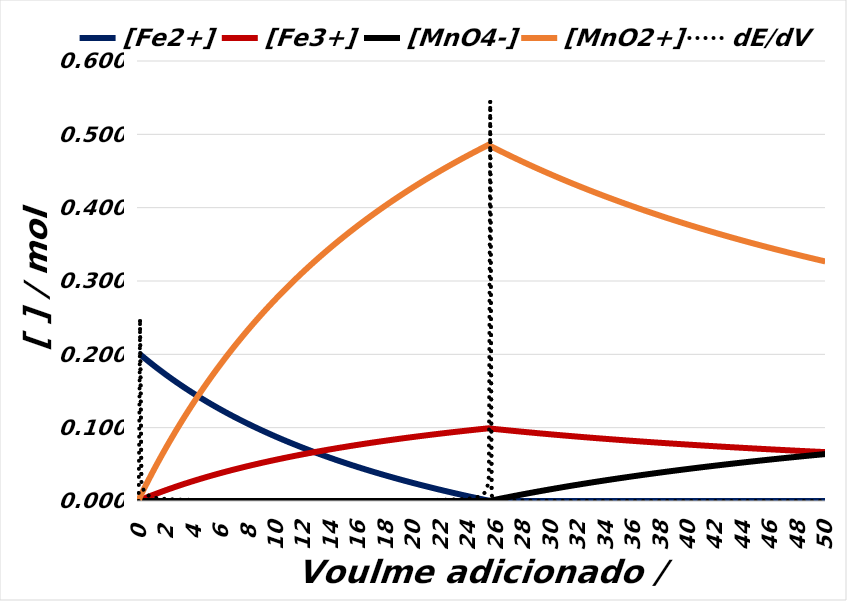
| Category | [Fe2+] | [Fe3+] | [MnO4-] | [MnO2+] |
|---|---|---|---|---|
| 0.0 | 0.2 | 0 | 0 | 0 |
| 0.1 | 0.2 | 0.001 | 0 | 0.006 |
| 0.2 | 0.198 | 0.002 | 0 | 0.01 |
| 0.3 | 0.197 | 0.003 | 0 | 0.013 |
| 0.4 | 0.195 | 0.003 | 0 | 0.017 |
| 0.5 | 0.194 | 0.004 | 0 | 0.021 |
| 0.6 | 0.192 | 0.005 | 0 | 0.024 |
| 0.7 | 0.191 | 0.006 | 0 | 0.028 |
| 0.8 | 0.189 | 0.006 | 0 | 0.032 |
| 0.9 | 0.188 | 0.007 | 0 | 0.035 |
| 1.0 | 0.186 | 0.008 | 0 | 0.039 |
| 1.1 | 0.185 | 0.009 | 0 | 0.042 |
| 1.2 | 0.183 | 0.009 | 0 | 0.046 |
| 1.3 | 0.182 | 0.01 | 0 | 0.049 |
| 1.4 | 0.18 | 0.011 | 0 | 0.053 |
| 1.5 | 0.179 | 0.011 | 0 | 0.056 |
| 1.6 | 0.178 | 0.012 | 0 | 0.06 |
| 1.7 | 0.176 | 0.013 | 0 | 0.063 |
| 1.8 | 0.175 | 0.014 | 0 | 0.066 |
| 1.9 | 0.173 | 0.014 | 0 | 0.07 |
| 2.0 | 0.172 | 0.015 | 0 | 0.073 |
| 2.1 | 0.171 | 0.016 | 0 | 0.076 |
| 2.2 | 0.169 | 0.016 | 0 | 0.079 |
| 2.3 | 0.168 | 0.017 | 0 | 0.083 |
| 2.4 | 0.167 | 0.018 | 0 | 0.086 |
| 2.5 | 0.165 | 0.018 | 0 | 0.089 |
| 2.6 | 0.164 | 0.019 | 0 | 0.092 |
| 2.7 | 0.163 | 0.019 | 0 | 0.095 |
| 2.8 | 0.161 | 0.02 | 0 | 0.098 |
| 2.9 | 0.16 | 0.021 | 0 | 0.102 |
| 3.0 | 0.159 | 0.021 | 0 | 0.105 |
| 3.1 | 0.158 | 0.022 | 0 | 0.108 |
| 3.2 | 0.156 | 0.023 | 0 | 0.111 |
| 3.3 | 0.155 | 0.023 | 0 | 0.114 |
| 3.4 | 0.154 | 0.024 | 0 | 0.117 |
| 3.5 | 0.153 | 0.024 | 0 | 0.12 |
| 3.6 | 0.151 | 0.025 | 0 | 0.123 |
| 3.7 | 0.15 | 0.026 | 0 | 0.126 |
| 3.8 | 0.149 | 0.026 | 0 | 0.128 |
| 3.9 | 0.148 | 0.027 | 0 | 0.131 |
| 4.0 | 0.147 | 0.027 | 0 | 0.134 |
| 4.1 | 0.145 | 0.028 | 0 | 0.137 |
| 4.2 | 0.144 | 0.029 | 0 | 0.14 |
| 4.3 | 0.143 | 0.029 | 0 | 0.143 |
| 4.4 | 0.142 | 0.03 | 0 | 0.145 |
| 4.5 | 0.141 | 0.03 | 0 | 0.148 |
| 4.6 | 0.14 | 0.031 | 0 | 0.151 |
| 4.7 | 0.138 | 0.031 | 0 | 0.154 |
| 4.8 | 0.137 | 0.032 | 0 | 0.156 |
| 4.9 | 0.136 | 0.032 | 0 | 0.159 |
| 5.0 | 0.135 | 0.033 | 0 | 0.162 |
| 5.1 | 0.134 | 0.034 | 0 | 0.164 |
| 5.2 | 0.133 | 0.034 | 0 | 0.167 |
| 5.3 | 0.132 | 0.035 | 0 | 0.17 |
| 5.4 | 0.131 | 0.035 | 0 | 0.172 |
| 5.5 | 0.13 | 0.036 | 0 | 0.175 |
| 5.6 | 0.129 | 0.036 | 0 | 0.177 |
| 5.7 | 0.128 | 0.037 | 0 | 0.18 |
| 5.8 | 0.126 | 0.037 | 0 | 0.182 |
| 5.9 | 0.125 | 0.038 | 0 | 0.185 |
| 6.0 | 0.124 | 0.038 | 0 | 0.187 |
| 6.1 | 0.123 | 0.039 | 0 | 0.19 |
| 6.2 | 0.122 | 0.039 | 0 | 0.192 |
| 6.3 | 0.121 | 0.04 | 0 | 0.195 |
| 6.4 | 0.12 | 0.04 | 0 | 0.197 |
| 6.5 | 0.119 | 0.041 | 0 | 0.2 |
| 6.6 | 0.118 | 0.041 | 0 | 0.202 |
| 6.7 | 0.117 | 0.042 | 0 | 0.205 |
| 6.8 | 0.116 | 0.042 | 0 | 0.207 |
| 6.9 | 0.115 | 0.043 | 0 | 0.209 |
| 7.0 | 0.114 | 0.043 | 0 | 0.212 |
| 7.1 | 0.113 | 0.044 | 0 | 0.214 |
| 7.2 | 0.112 | 0.044 | 0 | 0.216 |
| 7.3 | 0.111 | 0.045 | 0 | 0.219 |
| 7.4 | 0.111 | 0.045 | 0 | 0.221 |
| 7.5 | 0.11 | 0.046 | 0 | 0.223 |
| 7.6 | 0.109 | 0.046 | 0 | 0.225 |
| 7.7 | 0.108 | 0.046 | 0 | 0.228 |
| 7.8 | 0.107 | 0.047 | 0 | 0.23 |
| 7.9 | 0.106 | 0.047 | 0 | 0.232 |
| 8.0 | 0.105 | 0.048 | 0 | 0.234 |
| 8.1 | 0.104 | 0.048 | 0 | 0.237 |
| 8.2 | 0.103 | 0.049 | 0 | 0.239 |
| 8.3 | 0.102 | 0.049 | 0 | 0.241 |
| 8.4 | 0.101 | 0.05 | 0 | 0.243 |
| 8.5 | 0.1 | 0.05 | 0 | 0.245 |
| 8.6 | 0.1 | 0.05 | 0 | 0.247 |
| 8.7 | 0.099 | 0.051 | 0 | 0.249 |
| 8.8 | 0.098 | 0.051 | 0 | 0.251 |
| 8.9 | 0.097 | 0.052 | 0 | 0.254 |
| 9.0 | 0.096 | 0.052 | 0 | 0.256 |
| 9.1 | 0.095 | 0.053 | 0 | 0.258 |
| 9.2 | 0.094 | 0.053 | 0 | 0.26 |
| 9.3 | 0.093 | 0.053 | 0 | 0.262 |
| 9.4 | 0.093 | 0.054 | 0 | 0.264 |
| 9.5 | 0.092 | 0.054 | 0 | 0.266 |
| 9.6 | 0.091 | 0.055 | 0 | 0.268 |
| 9.7 | 0.09 | 0.055 | 0 | 0.27 |
| 9.8 | 0.089 | 0.055 | 0 | 0.272 |
| 9.9 | 0.088 | 0.056 | 0 | 0.274 |
| 10.0 | 0.088 | 0.056 | 0 | 0.276 |
| 10.1 | 0.087 | 0.057 | 0 | 0.278 |
| 10.2 | 0.086 | 0.057 | 0 | 0.28 |
| 10.3 | 0.085 | 0.057 | 0 | 0.282 |
| 10.4 | 0.084 | 0.058 | 0 | 0.284 |
| 10.5 | 0.084 | 0.058 | 0 | 0.285 |
| 10.6 | 0.083 | 0.059 | 0 | 0.287 |
| 10.7 | 0.082 | 0.059 | 0 | 0.289 |
| 10.8 | 0.081 | 0.059 | 0 | 0.291 |
| 10.9 | 0.081 | 0.06 | 0 | 0.293 |
| 11.0 | 0.08 | 0.06 | 0 | 0.295 |
| 11.1 | 0.079 | 0.061 | 0 | 0.297 |
| 11.2 | 0.078 | 0.061 | 0 | 0.298 |
| 11.3 | 0.077 | 0.061 | 0 | 0.3 |
| 11.4 | 0.077 | 0.062 | 0 | 0.302 |
| 11.5 | 0.076 | 0.062 | 0 | 0.304 |
| 11.6 | 0.075 | 0.062 | 0 | 0.306 |
| 11.7 | 0.074 | 0.063 | 0 | 0.308 |
| 11.8 | 0.074 | 0.063 | 0 | 0.309 |
| 11.9 | 0.073 | 0.063 | 0 | 0.311 |
| 12.0 | 0.072 | 0.064 | 0 | 0.313 |
| 12.1 | 0.072 | 0.064 | 0 | 0.315 |
| 12.2 | 0.071 | 0.065 | 0 | 0.316 |
| 12.3 | 0.07 | 0.065 | 0 | 0.318 |
| 12.4 | 0.069 | 0.065 | 0 | 0.32 |
| 12.5 | 0.069 | 0.066 | 0 | 0.321 |
| 12.6 | 0.068 | 0.066 | 0 | 0.323 |
| 12.7 | 0.067 | 0.066 | 0 | 0.325 |
| 12.8 | 0.067 | 0.067 | 0 | 0.327 |
| 12.9 | 0.066 | 0.067 | 0 | 0.328 |
| 13.0 | 0.065 | 0.067 | 0 | 0.33 |
| 13.1 | 0.065 | 0.068 | 0 | 0.332 |
| 13.2 | 0.064 | 0.068 | 0 | 0.333 |
| 13.3 | 0.063 | 0.068 | 0 | 0.335 |
| 13.4 | 0.062 | 0.069 | 0 | 0.336 |
| 13.5 | 0.062 | 0.069 | 0 | 0.338 |
| 13.6 | 0.061 | 0.069 | 0 | 0.34 |
| 13.7 | 0.06 | 0.07 | 0 | 0.341 |
| 13.8 | 0.06 | 0.07 | 0 | 0.343 |
| 13.9 | 0.059 | 0.07 | 0 | 0.344 |
| 14.0 | 0.058 | 0.071 | 0 | 0.346 |
| 14.1 | 0.058 | 0.071 | 0 | 0.348 |
| 14.2 | 0.057 | 0.071 | 0 | 0.349 |
| 14.3 | 0.057 | 0.072 | 0 | 0.351 |
| 14.4 | 0.056 | 0.072 | 0 | 0.352 |
| 14.5 | 0.055 | 0.072 | 0 | 0.354 |
| 14.6 | 0.055 | 0.073 | 0 | 0.355 |
| 14.7 | 0.054 | 0.073 | 0 | 0.357 |
| 14.8 | 0.053 | 0.073 | 0 | 0.358 |
| 14.9 | 0.053 | 0.073 | 0 | 0.36 |
| 15.0 | 0.052 | 0.074 | 0 | 0.361 |
| 15.1 | 0.052 | 0.074 | 0 | 0.363 |
| 15.2 | 0.051 | 0.074 | 0 | 0.364 |
| 15.3 | 0.05 | 0.075 | 0 | 0.366 |
| 15.4 | 0.05 | 0.075 | 0 | 0.367 |
| 15.5 | 0.049 | 0.075 | 0 | 0.369 |
| 15.6 | 0.048 | 0.076 | 0 | 0.37 |
| 15.7 | 0.048 | 0.076 | 0 | 0.372 |
| 15.8 | 0.047 | 0.076 | 0 | 0.373 |
| 15.9 | 0.047 | 0.076 | 0 | 0.375 |
| 16.0 | 0.046 | 0.077 | 0 | 0.376 |
| 16.1 | 0.045 | 0.077 | 0 | 0.377 |
| 16.2 | 0.045 | 0.077 | 0 | 0.379 |
| 16.3 | 0.044 | 0.078 | 0 | 0.38 |
| 16.4 | 0.044 | 0.078 | 0 | 0.382 |
| 16.5 | 0.043 | 0.078 | 0 | 0.383 |
| 16.6 | 0.043 | 0.078 | 0 | 0.384 |
| 16.7 | 0.042 | 0.079 | 0 | 0.386 |
| 16.8 | 0.041 | 0.079 | 0 | 0.387 |
| 16.9 | 0.041 | 0.079 | 0 | 0.389 |
| 17.0 | 0.04 | 0.08 | 0 | 0.39 |
| 17.1 | 0.04 | 0.08 | 0 | 0.391 |
| 17.2 | 0.039 | 0.08 | 0 | 0.393 |
| 17.3 | 0.039 | 0.08 | 0 | 0.394 |
| 17.4 | 0.038 | 0.081 | 0 | 0.395 |
| 17.5 | 0.037 | 0.081 | 0 | 0.397 |
| 17.6 | 0.037 | 0.081 | 0 | 0.398 |
| 17.7 | 0.036 | 0.081 | 0 | 0.399 |
| 17.8 | 0.036 | 0.082 | 0 | 0.401 |
| 17.9 | 0.035 | 0.082 | 0 | 0.402 |
| 18.0 | 0.035 | 0.082 | 0 | 0.403 |
| 18.1 | 0.034 | 0.083 | 0 | 0.404 |
| 18.2 | 0.034 | 0.083 | 0 | 0.406 |
| 18.3 | 0.033 | 0.083 | 0 | 0.407 |
| 18.4 | 0.033 | 0.083 | 0 | 0.408 |
| 18.5 | 0.032 | 0.084 | 0 | 0.41 |
| 18.6 | 0.032 | 0.084 | 0 | 0.411 |
| 18.7 | 0.031 | 0.084 | 0 | 0.412 |
| 18.8 | 0.031 | 0.084 | 0 | 0.413 |
| 18.9 | 0.03 | 0.085 | 0 | 0.415 |
| 19.0 | 0.03 | 0.085 | 0 | 0.416 |
| 19.1 | 0.029 | 0.085 | 0 | 0.417 |
| 19.2 | 0.028 | 0.085 | 0 | 0.418 |
| 19.3 | 0.028 | 0.086 | 0 | 0.42 |
| 19.4 | 0.027 | 0.086 | 0 | 0.421 |
| 19.5 | 0.027 | 0.086 | 0 | 0.422 |
| 19.6 | 0.026 | 0.086 | 0 | 0.423 |
| 19.7 | 0.026 | 0.087 | 0 | 0.424 |
| 19.8 | 0.025 | 0.087 | 0 | 0.426 |
| 19.9 | 0.025 | 0.087 | 0 | 0.427 |
| 20.0 | 0.024 | 0.087 | 0 | 0.428 |
| 20.1 | 0.024 | 0.088 | 0 | 0.429 |
| 20.2 | 0.024 | 0.088 | 0 | 0.43 |
| 20.3 | 0.023 | 0.088 | 0 | 0.431 |
| 20.4 | 0.023 | 0.088 | 0 | 0.433 |
| 20.5 | 0.022 | 0.089 | 0 | 0.434 |
| 20.6 | 0.022 | 0.089 | 0 | 0.435 |
| 20.7 | 0.021 | 0.089 | 0 | 0.436 |
| 20.8 | 0.021 | 0.089 | 0 | 0.437 |
| 20.9 | 0.02 | 0.089 | 0 | 0.438 |
| 21.0 | 0.02 | 0.09 | 0 | 0.44 |
| 21.1 | 0.019 | 0.09 | 0 | 0.441 |
| 21.2 | 0.019 | 0.09 | 0 | 0.442 |
| 21.3 | 0.018 | 0.09 | 0 | 0.443 |
| 21.4 | 0.018 | 0.091 | 0 | 0.444 |
| 21.5 | 0.017 | 0.091 | 0 | 0.445 |
| 21.6 | 0.017 | 0.091 | 0 | 0.446 |
| 21.7 | 0.016 | 0.091 | 0 | 0.447 |
| 21.8 | 0.016 | 0.092 | 0 | 0.448 |
| 21.9 | 0.016 | 0.092 | 0 | 0.45 |
| 22.0 | 0.015 | 0.092 | 0 | 0.451 |
| 22.1 | 0.015 | 0.092 | 0 | 0.452 |
| 22.2 | 0.014 | 0.092 | 0 | 0.453 |
| 22.3 | 0.014 | 0.093 | 0 | 0.454 |
| 22.4 | 0.013 | 0.093 | 0 | 0.455 |
| 22.5 | 0.013 | 0.093 | 0 | 0.456 |
| 22.6 | 0.012 | 0.093 | 0 | 0.457 |
| 22.7 | 0.012 | 0.093 | 0 | 0.458 |
| 22.8 | 0.012 | 0.094 | 0 | 0.459 |
| 22.9 | 0.011 | 0.094 | 0 | 0.46 |
| 23.0 | 0.011 | 0.094 | 0 | 0.461 |
| 23.1 | 0.01 | 0.094 | 0 | 0.462 |
| 23.2 | 0.01 | 0.095 | 0 | 0.463 |
| 23.3 | 0.009 | 0.095 | 0 | 0.464 |
| 23.4 | 0.009 | 0.095 | 0 | 0.465 |
| 23.5 | 0.009 | 0.095 | 0 | 0.466 |
| 23.6 | 0.008 | 0.095 | 0 | 0.467 |
| 23.7 | 0.008 | 0.096 | 0 | 0.468 |
| 23.8 | 0.007 | 0.096 | 0 | 0.469 |
| 23.9 | 0.007 | 0.096 | 0 | 0.47 |
| 24.0 | 0.006 | 0.096 | 0 | 0.471 |
| 24.1 | 0.006 | 0.096 | 0 | 0.472 |
| 24.2 | 0.006 | 0.097 | 0 | 0.473 |
| 24.3 | 0.005 | 0.097 | 0 | 0.474 |
| 24.4 | 0.005 | 0.097 | 0 | 0.475 |
| 24.5 | 0.004 | 0.097 | 0 | 0.476 |
| 24.6 | 0.004 | 0.097 | 0 | 0.477 |
| 24.7 | 0.004 | 0.098 | 0 | 0.478 |
| 24.8 | 0.003 | 0.098 | 0 | 0.479 |
| 24.9 | 0.003 | 0.098 | 0 | 0.48 |
| 25.0 | 0.002 | 0.098 | 0 | 0.481 |
| 25.1 | 0.002 | 0.098 | 0 | 0.482 |
| 25.2 | 0.002 | 0.099 | 0 | 0.483 |
| 25.3 | 0.001 | 0.099 | 0 | 0.484 |
| 25.4 | 0.001 | 0.099 | 0 | 0.485 |
| 25.5 | 0 | 0.099 | 0 | 0.486 |
| 25.6 | 0 | 0.099 | 0 | 0.484 |
| 25.7 | 0 | 0.099 | 0.001 | 0.483 |
| 25.8 | 0 | 0.098 | 0.001 | 0.482 |
| 25.9 | 0 | 0.098 | 0.002 | 0.481 |
| 26.0 | 0 | 0.098 | 0.002 | 0.48 |
| 26.1 | 0 | 0.098 | 0.002 | 0.479 |
| 26.2 | 0 | 0.098 | 0.003 | 0.479 |
| 26.3 | 0 | 0.097 | 0.003 | 0.478 |
| 26.4 | 0 | 0.097 | 0.003 | 0.477 |
| 26.5 | 0 | 0.097 | 0.004 | 0.476 |
| 26.6 | 0 | 0.097 | 0.004 | 0.475 |
| 26.7 | 0 | 0.097 | 0.005 | 0.474 |
| 26.8 | 0 | 0.097 | 0.005 | 0.473 |
| 26.9 | 0 | 0.096 | 0.005 | 0.472 |
| 27.0 | 0 | 0.096 | 0.006 | 0.471 |
| 27.1 | 0 | 0.096 | 0.006 | 0.47 |
| 27.2 | 0 | 0.096 | 0.006 | 0.469 |
| 27.3 | 0 | 0.096 | 0.007 | 0.468 |
| 27.4 | 0 | 0.095 | 0.007 | 0.468 |
| 27.5 | 0 | 0.095 | 0.007 | 0.467 |
| 27.6 | 0 | 0.095 | 0.008 | 0.466 |
| 27.7 | 0 | 0.095 | 0.008 | 0.465 |
| 27.8 | 0 | 0.095 | 0.008 | 0.464 |
| 27.9 | 0 | 0.095 | 0.009 | 0.463 |
| 28.0 | 0 | 0.094 | 0.009 | 0.462 |
| 28.1 | 0 | 0.094 | 0.01 | 0.461 |
| 28.2 | 0 | 0.094 | 0.01 | 0.461 |
| 28.3 | 0 | 0.094 | 0.01 | 0.46 |
| 28.4 | 0 | 0.094 | 0.011 | 0.459 |
| 28.5 | 0 | 0.093 | 0.011 | 0.458 |
| 28.6 | 0 | 0.093 | 0.011 | 0.457 |
| 28.7 | 0 | 0.093 | 0.012 | 0.456 |
| 28.8 | 0 | 0.093 | 0.012 | 0.455 |
| 28.9 | 0 | 0.093 | 0.012 | 0.455 |
| 29.0 | 0 | 0.093 | 0.013 | 0.454 |
| 29.1 | 0 | 0.092 | 0.013 | 0.453 |
| 29.2 | 0 | 0.092 | 0.013 | 0.452 |
| 29.3 | 0 | 0.092 | 0.014 | 0.451 |
| 29.4 | 0 | 0.092 | 0.014 | 0.45 |
| 29.5 | 0 | 0.092 | 0.014 | 0.45 |
| 29.6 | 0 | 0.092 | 0.015 | 0.449 |
| 29.7 | 0 | 0.091 | 0.015 | 0.448 |
| 29.8 | 0 | 0.091 | 0.015 | 0.447 |
| 29.9 | 0 | 0.091 | 0.016 | 0.446 |
| 30.0 | 0 | 0.091 | 0.016 | 0.445 |
| 30.1 | 0 | 0.091 | 0.016 | 0.445 |
| 30.2 | 0 | 0.091 | 0.017 | 0.444 |
| 30.3 | 0 | 0.09 | 0.017 | 0.443 |
| 30.4 | 0 | 0.09 | 0.017 | 0.442 |
| 30.5 | 0 | 0.09 | 0.018 | 0.441 |
| 30.6 | 0 | 0.09 | 0.018 | 0.441 |
| 30.7 | 0 | 0.09 | 0.018 | 0.44 |
| 30.8 | 0 | 0.09 | 0.019 | 0.439 |
| 30.9 | 0 | 0.089 | 0.019 | 0.438 |
| 31.0 | 0 | 0.089 | 0.019 | 0.438 |
| 31.1 | 0 | 0.089 | 0.02 | 0.437 |
| 31.2 | 0 | 0.089 | 0.02 | 0.436 |
| 31.3 | 0 | 0.089 | 0.02 | 0.435 |
| 31.4 | 0 | 0.089 | 0.02 | 0.434 |
| 31.5 | 0 | 0.088 | 0.021 | 0.434 |
| 31.6 | 0 | 0.088 | 0.021 | 0.433 |
| 31.7 | 0 | 0.088 | 0.021 | 0.432 |
| 31.8 | 0 | 0.088 | 0.022 | 0.431 |
| 31.9 | 0 | 0.088 | 0.022 | 0.431 |
| 32.0 | 0 | 0.088 | 0.022 | 0.43 |
| 32.1 | 0 | 0.088 | 0.023 | 0.429 |
| 32.2 | 0 | 0.087 | 0.023 | 0.428 |
| 32.3 | 0 | 0.087 | 0.023 | 0.428 |
| 32.4 | 0 | 0.087 | 0.024 | 0.427 |
| 32.5 | 0 | 0.087 | 0.024 | 0.426 |
| 32.6 | 0 | 0.087 | 0.024 | 0.425 |
| 32.7 | 0 | 0.087 | 0.024 | 0.425 |
| 32.8 | 0 | 0.087 | 0.025 | 0.424 |
| 32.9 | 0 | 0.086 | 0.025 | 0.423 |
| 33.0 | 0 | 0.086 | 0.025 | 0.422 |
| 33.1 | 0 | 0.086 | 0.026 | 0.422 |
| 33.2 | 0 | 0.086 | 0.026 | 0.421 |
| 33.3 | 0 | 0.086 | 0.026 | 0.42 |
| 33.4 | 0 | 0.086 | 0.026 | 0.42 |
| 33.5 | 0 | 0.085 | 0.027 | 0.419 |
| 33.6 | 0 | 0.085 | 0.027 | 0.418 |
| 33.7 | 0 | 0.085 | 0.027 | 0.417 |
| 33.8 | 0 | 0.085 | 0.028 | 0.417 |
| 33.9 | 0 | 0.085 | 0.028 | 0.416 |
| 34.0 | 0 | 0.085 | 0.028 | 0.415 |
| 34.1 | 0 | 0.085 | 0.028 | 0.415 |
| 34.2 | 0 | 0.084 | 0.029 | 0.414 |
| 34.3 | 0 | 0.084 | 0.029 | 0.413 |
| 34.4 | 0 | 0.084 | 0.029 | 0.412 |
| 34.5 | 0 | 0.084 | 0.03 | 0.412 |
| 34.6 | 0 | 0.084 | 0.03 | 0.411 |
| 34.7 | 0 | 0.084 | 0.03 | 0.41 |
| 34.8 | 0 | 0.084 | 0.03 | 0.41 |
| 34.9 | 0 | 0.083 | 0.031 | 0.409 |
| 35.0 | 0 | 0.083 | 0.031 | 0.408 |
| 35.1 | 0 | 0.083 | 0.031 | 0.408 |
| 35.2 | 0 | 0.083 | 0.032 | 0.407 |
| 35.3 | 0 | 0.083 | 0.032 | 0.406 |
| 35.4 | 0 | 0.083 | 0.032 | 0.406 |
| 35.5 | 0 | 0.083 | 0.032 | 0.405 |
| 35.6 | 0 | 0.083 | 0.033 | 0.404 |
| 35.7 | 0 | 0.082 | 0.033 | 0.404 |
| 35.8 | 0 | 0.082 | 0.033 | 0.403 |
| 35.9 | 0 | 0.082 | 0.033 | 0.402 |
| 36.0 | 0 | 0.082 | 0.034 | 0.402 |
| 36.1 | 0 | 0.082 | 0.034 | 0.401 |
| 36.2 | 0 | 0.082 | 0.034 | 0.4 |
| 36.3 | 0 | 0.082 | 0.034 | 0.4 |
| 36.4 | 0 | 0.081 | 0.035 | 0.399 |
| 36.5 | 0 | 0.081 | 0.035 | 0.398 |
| 36.6 | 0 | 0.081 | 0.035 | 0.398 |
| 36.7 | 0 | 0.081 | 0.036 | 0.397 |
| 36.8 | 0 | 0.081 | 0.036 | 0.396 |
| 36.9 | 0 | 0.081 | 0.036 | 0.396 |
| 37.0 | 0 | 0.081 | 0.036 | 0.395 |
| 37.1 | 0 | 0.081 | 0.037 | 0.395 |
| 37.2 | 0 | 0.08 | 0.037 | 0.394 |
| 37.3 | 0 | 0.08 | 0.037 | 0.393 |
| 37.4 | 0 | 0.08 | 0.037 | 0.393 |
| 37.5 | 0 | 0.08 | 0.038 | 0.392 |
| 37.6 | 0 | 0.08 | 0.038 | 0.391 |
| 37.7 | 0 | 0.08 | 0.038 | 0.391 |
| 37.8 | 0 | 0.08 | 0.038 | 0.39 |
| 37.9 | 0 | 0.079 | 0.039 | 0.39 |
| 38.0 | 0 | 0.079 | 0.039 | 0.389 |
| 38.1 | 0 | 0.079 | 0.039 | 0.388 |
| 38.2 | 0 | 0.079 | 0.039 | 0.388 |
| 38.3 | 0 | 0.079 | 0.04 | 0.387 |
| 38.4 | 0 | 0.079 | 0.04 | 0.386 |
| 38.5 | 0 | 0.079 | 0.04 | 0.386 |
| 38.6 | 0 | 0.079 | 0.04 | 0.385 |
| 38.7 | 0 | 0.078 | 0.041 | 0.385 |
| 38.8 | 0 | 0.078 | 0.041 | 0.384 |
| 38.9 | 0 | 0.078 | 0.041 | 0.383 |
| 39.0 | 0 | 0.078 | 0.041 | 0.383 |
| 39.1 | 0 | 0.078 | 0.042 | 0.382 |
| 39.2 | 0 | 0.078 | 0.042 | 0.382 |
| 39.3 | 0 | 0.078 | 0.042 | 0.381 |
| 39.4 | 0 | 0.078 | 0.042 | 0.38 |
| 39.5 | 0 | 0.078 | 0.043 | 0.38 |
| 39.6 | 0 | 0.077 | 0.043 | 0.379 |
| 39.7 | 0 | 0.077 | 0.043 | 0.379 |
| 39.8 | 0 | 0.077 | 0.043 | 0.378 |
| 39.9 | 0 | 0.077 | 0.043 | 0.378 |
| 40.0 | 0 | 0.077 | 0.044 | 0.377 |
| 40.1 | 0 | 0.077 | 0.044 | 0.376 |
| 40.2 | 0 | 0.077 | 0.044 | 0.376 |
| 40.3 | 0 | 0.077 | 0.044 | 0.375 |
| 40.4 | 0 | 0.076 | 0.045 | 0.375 |
| 40.5 | 0 | 0.076 | 0.045 | 0.374 |
| 40.6 | 0 | 0.076 | 0.045 | 0.373 |
| 40.7 | 0 | 0.076 | 0.045 | 0.373 |
| 40.8 | 0 | 0.076 | 0.046 | 0.372 |
| 40.9 | 0 | 0.076 | 0.046 | 0.372 |
| 41.0 | 0 | 0.076 | 0.046 | 0.371 |
| 41.1 | 0 | 0.076 | 0.046 | 0.371 |
| 41.2 | 0 | 0.076 | 0.046 | 0.37 |
| 41.3 | 0 | 0.075 | 0.047 | 0.37 |
| 41.4 | 0 | 0.075 | 0.047 | 0.369 |
| 41.5 | 0 | 0.075 | 0.047 | 0.368 |
| 41.6 | 0 | 0.075 | 0.047 | 0.368 |
| 41.7 | 0 | 0.075 | 0.048 | 0.367 |
| 41.8 | 0 | 0.075 | 0.048 | 0.367 |
| 41.9 | 0 | 0.075 | 0.048 | 0.366 |
| 42.0 | 0 | 0.075 | 0.048 | 0.366 |
| 42.1 | 0 | 0.075 | 0.048 | 0.365 |
| 42.2 | 0 | 0.074 | 0.049 | 0.365 |
| 42.3 | 0 | 0.074 | 0.049 | 0.364 |
| 42.4 | 0 | 0.074 | 0.049 | 0.364 |
| 42.5 | 0 | 0.074 | 0.049 | 0.363 |
| 42.6 | 0 | 0.074 | 0.05 | 0.362 |
| 42.7 | 0 | 0.074 | 0.05 | 0.362 |
| 42.8 | 0 | 0.074 | 0.05 | 0.361 |
| 42.9 | 0 | 0.074 | 0.05 | 0.361 |
| 43.0 | 0 | 0.074 | 0.05 | 0.36 |
| 43.1 | 0 | 0.073 | 0.051 | 0.36 |
| 43.2 | 0 | 0.073 | 0.051 | 0.359 |
| 43.3 | 0 | 0.073 | 0.051 | 0.359 |
| 43.4 | 0 | 0.073 | 0.051 | 0.358 |
| 43.5 | 0 | 0.073 | 0.051 | 0.358 |
| 43.6 | 0 | 0.073 | 0.052 | 0.357 |
| 43.7 | 0 | 0.073 | 0.052 | 0.357 |
| 43.8 | 0 | 0.073 | 0.052 | 0.356 |
| 43.9 | 0 | 0.073 | 0.052 | 0.356 |
| 44.0 | 0 | 0.072 | 0.053 | 0.355 |
| 44.1 | 0 | 0.072 | 0.053 | 0.355 |
| 44.2 | 0 | 0.072 | 0.053 | 0.354 |
| 44.3 | 0 | 0.072 | 0.053 | 0.354 |
| 44.4 | 0 | 0.072 | 0.053 | 0.353 |
| 44.5 | 0 | 0.072 | 0.054 | 0.353 |
| 44.6 | 0 | 0.072 | 0.054 | 0.352 |
| 44.7 | 0 | 0.072 | 0.054 | 0.352 |
| 44.8 | 0 | 0.072 | 0.054 | 0.351 |
| 44.9 | 0 | 0.072 | 0.054 | 0.351 |
| 45.0 | 0 | 0.071 | 0.055 | 0.35 |
| 45.1 | 0 | 0.071 | 0.055 | 0.35 |
| 45.2 | 0 | 0.071 | 0.055 | 0.349 |
| 45.3 | 0 | 0.071 | 0.055 | 0.349 |
| 45.4 | 0 | 0.071 | 0.055 | 0.348 |
| 45.5 | 0 | 0.071 | 0.056 | 0.348 |
| 45.6 | 0 | 0.071 | 0.056 | 0.347 |
| 45.7 | 0 | 0.071 | 0.056 | 0.347 |
| 45.8 | 0 | 0.071 | 0.056 | 0.346 |
| 45.9 | 0 | 0.071 | 0.056 | 0.346 |
| 46.0 | 0 | 0.07 | 0.057 | 0.345 |
| 46.1 | 0 | 0.07 | 0.057 | 0.345 |
| 46.2 | 0 | 0.07 | 0.057 | 0.344 |
| 46.3 | 0 | 0.07 | 0.057 | 0.344 |
| 46.4 | 0 | 0.07 | 0.057 | 0.343 |
| 46.5 | 0 | 0.07 | 0.058 | 0.343 |
| 46.6 | 0 | 0.07 | 0.058 | 0.342 |
| 46.7 | 0 | 0.07 | 0.058 | 0.342 |
| 46.8 | 0 | 0.07 | 0.058 | 0.341 |
| 46.9 | 0 | 0.07 | 0.058 | 0.341 |
| 47.0 | 0 | 0.069 | 0.058 | 0.34 |
| 47.1 | 0 | 0.069 | 0.059 | 0.34 |
| 47.2 | 0 | 0.069 | 0.059 | 0.339 |
| 47.3 | 0 | 0.069 | 0.059 | 0.339 |
| 47.4 | 0 | 0.069 | 0.059 | 0.338 |
| 47.5 | 0 | 0.069 | 0.059 | 0.338 |
| 47.6 | 0 | 0.069 | 0.06 | 0.337 |
| 47.7 | 0 | 0.069 | 0.06 | 0.337 |
| 47.8 | 0 | 0.069 | 0.06 | 0.337 |
| 47.9 | 0 | 0.069 | 0.06 | 0.336 |
| 48.0 | 0 | 0.068 | 0.06 | 0.336 |
| 48.1 | 0 | 0.068 | 0.061 | 0.335 |
| 48.2 | 0 | 0.068 | 0.061 | 0.335 |
| 48.3 | 0 | 0.068 | 0.061 | 0.334 |
| 48.4 | 0 | 0.068 | 0.061 | 0.334 |
| 48.5 | 0 | 0.068 | 0.061 | 0.333 |
| 48.6 | 0 | 0.068 | 0.061 | 0.333 |
| 48.7 | 0 | 0.068 | 0.062 | 0.332 |
| 48.8 | 0 | 0.068 | 0.062 | 0.332 |
| 48.9 | 0 | 0.068 | 0.062 | 0.332 |
| 49.0 | 0 | 0.068 | 0.062 | 0.331 |
| 49.1 | 0 | 0.067 | 0.062 | 0.331 |
| 49.2 | 0 | 0.067 | 0.063 | 0.33 |
| 49.3 | 0 | 0.067 | 0.063 | 0.33 |
| 49.4 | 0 | 0.067 | 0.063 | 0.329 |
| 49.5 | 0 | 0.067 | 0.063 | 0.329 |
| 49.6 | 0 | 0.067 | 0.063 | 0.328 |
| 49.7 | 0 | 0.067 | 0.063 | 0.328 |
| 49.8 | 0 | 0.067 | 0.064 | 0.328 |
| 49.9 | 0 | 0.067 | 0.064 | 0.327 |
| 50.0 | 0 | 0.067 | 0.064 | 0.327 |